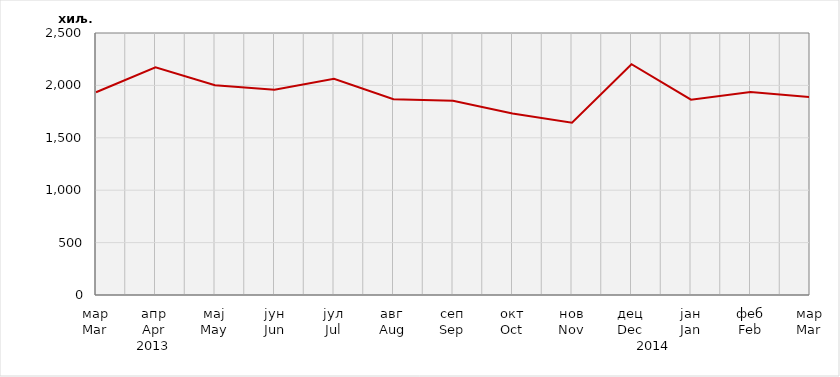
| Category | Нето тежина заклане стоке                              Net weight of  slaughtered livestock |
|---|---|
| мар
Mar | 1934364.7 |
| апр
Apr | 2171949.16 |
| мај
May | 2000890.05 |
| јун
Jun | 1958717.5 |
| јул
Jul | 2062735.23 |
| авг
Aug | 1867860.8 |
| сеп
Sep | 1852800.6 |
| окт
Oct | 1731807.5 |
| нов
Nov | 1643818.93 |
| дец
Dec | 2201954.6 |
| јан
Jan | 1864263.38 |
| феб
Feb | 1937876.26 |
| мар
Mar | 1889500 |